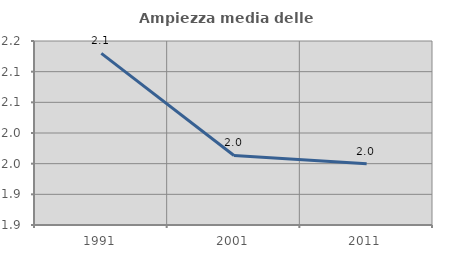
| Category | Ampiezza media delle famiglie |
|---|---|
| 1991.0 | 2.13 |
| 2001.0 | 1.963 |
| 2011.0 | 1.95 |